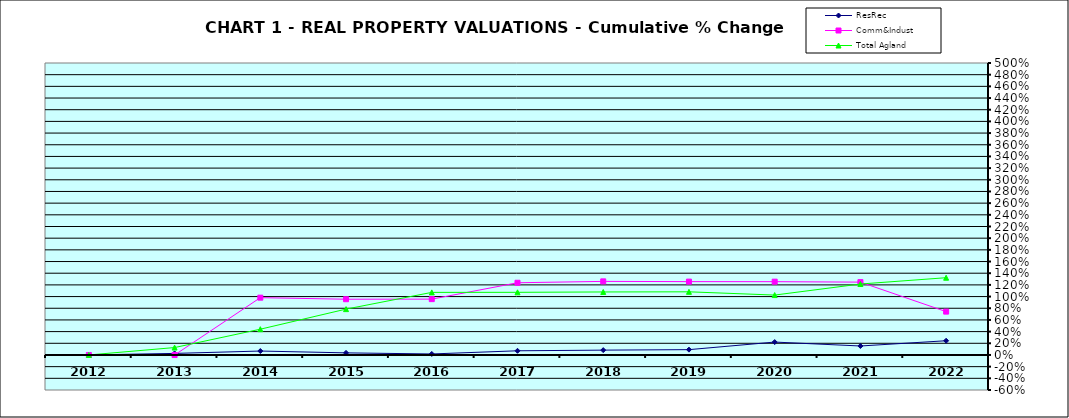
| Category | ResRec | Comm&Indust | Total Agland |
|---|---|---|---|
| 2012.0 | 0 | 0 | 0 |
| 2013.0 | 0.027 | -0.001 | 0.127 |
| 2014.0 | 0.067 | 0.981 | 0.441 |
| 2015.0 | 0.036 | 0.954 | 0.785 |
| 2016.0 | 0.017 | 0.956 | 1.072 |
| 2017.0 | 0.072 | 1.236 | 1.073 |
| 2018.0 | 0.083 | 1.26 | 1.079 |
| 2019.0 | 0.091 | 1.256 | 1.081 |
| 2020.0 | 0.221 | 1.255 | 1.026 |
| 2021.0 | 0.154 | 1.247 | 1.215 |
| 2022.0 | 0.243 | 0.742 | 1.323 |